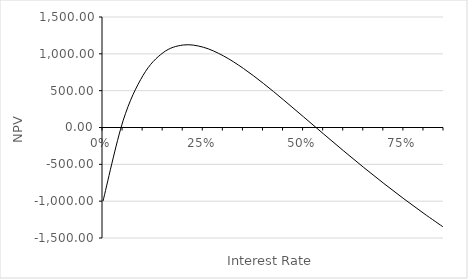
| Category | NPV |
|---|---|
| 0.0 | -1000 |
| 0.05 | 90.363 |
| 0.1 | 708.614 |
| 0.15000000000000002 | 1016.378 |
| 0.2 | 1119.856 |
| 0.25 | 1089.6 |
| 0.3 | 972.895 |
| 0.35 | 801.637 |
| 0.39999999999999997 | 597.43 |
| 0.44999999999999996 | 374.924 |
| 0.49999999999999994 | 144.033 |
| 0.5499999999999999 | -88.577 |
| 0.6 | -318.481 |
| 0.65 | -542.803 |
| 0.7000000000000001 | -759.738 |
| 0.7500000000000001 | -968.228 |
| 0.8000000000000002 | -1167.725 |
| 0.8500000000000002 | -1358.035 |